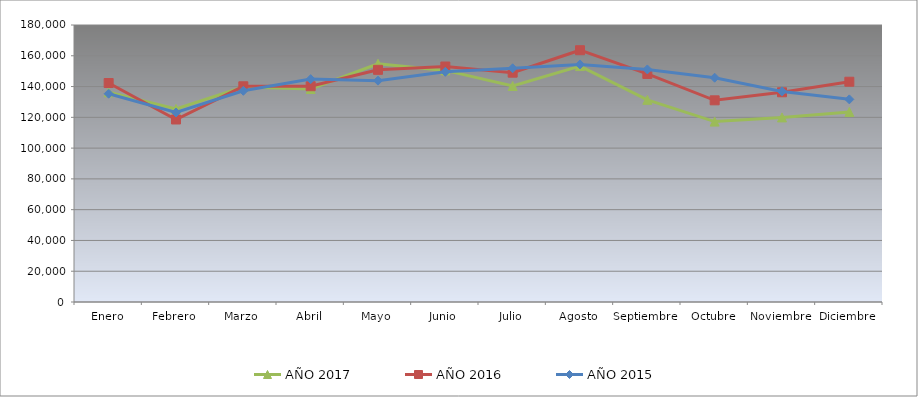
| Category | AÑO 2017 | AÑO 2016 | AÑO 2015 |
|---|---|---|---|
| Enero | 136269.708 | 142308.771 | 135349.802 |
| Febrero | 125483.839 | 118598.698 | 123136.342 |
| Marzo | 139740.599 | 140178.796 | 137229.661 |
| Abril | 138415.19 | 140214.241 | 144830.967 |
| Mayo | 154779.792 | 150873.785 | 143842.074 |
| Junio | 150505.647 | 153029.539 | 149569.943 |
| Julio | 140376.476 | 149020.932 | 151881.639 |
| Agosto | 153315.034 | 163618.191 | 154369.923 |
| Septiembre | 131374.903 | 148196.01 | 151133.549 |
| Octubre | 117241.474 | 131059.537 | 145752.434 |
| Noviembre | 119945.149 | 136281.36 | 136831.535 |
| Diciembre | 123488.117 | 143133.693 | 131676.774 |